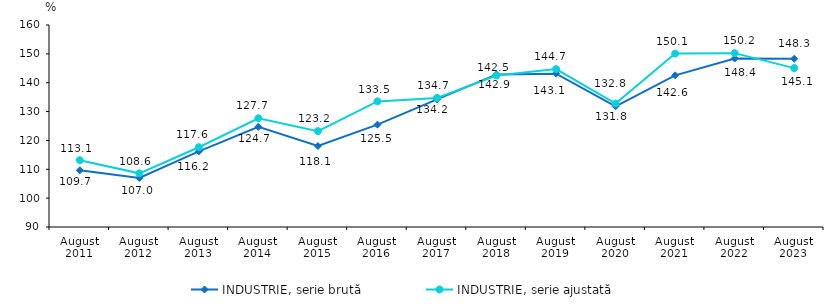
| Category | INDUSTRIE, serie brută | INDUSTRIE, serie ajustată |
|---|---|---|
| August
2011 | 109.654 | 113.132 |
| August
2012 | 106.993 | 108.594 |
| August
2013 | 116.214 | 117.647 |
| August
2014 | 124.715 | 127.692 |
| August
2015 | 118.057 | 123.227 |
| August
2016 | 125.471 | 133.532 |
| August
2017 | 134.223 | 134.725 |
| August
2018 | 142.865 | 142.519 |
| August
2019 | 143.143 | 144.719 |
| August
2020 | 131.83 | 132.778 |
| August
2021 | 142.557 | 150.09 |
| August
2022 | 148.401 | 150.243 |
| August
2023 | 148.302 | 145.066 |